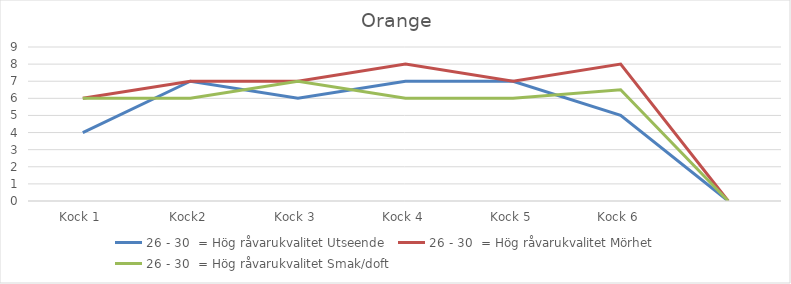
| Category | 26 - 30  = Hög råvarukvalitet Utseende | 26 - 30  = Hög råvarukvalitet Mörhet | 26 - 30  = Hög råvarukvalitet Smak/doft |
|---|---|---|---|
| Kock 1 | 4 | 6 | 6 |
| Kock2 | 7 | 7 | 6 |
| Kock 3 | 6 | 7 | 7 |
| Kock 4 | 7 | 8 | 6 |
| Kock 5 | 7 | 7 | 6 |
| Kock 6 | 5 | 8 | 6.5 |